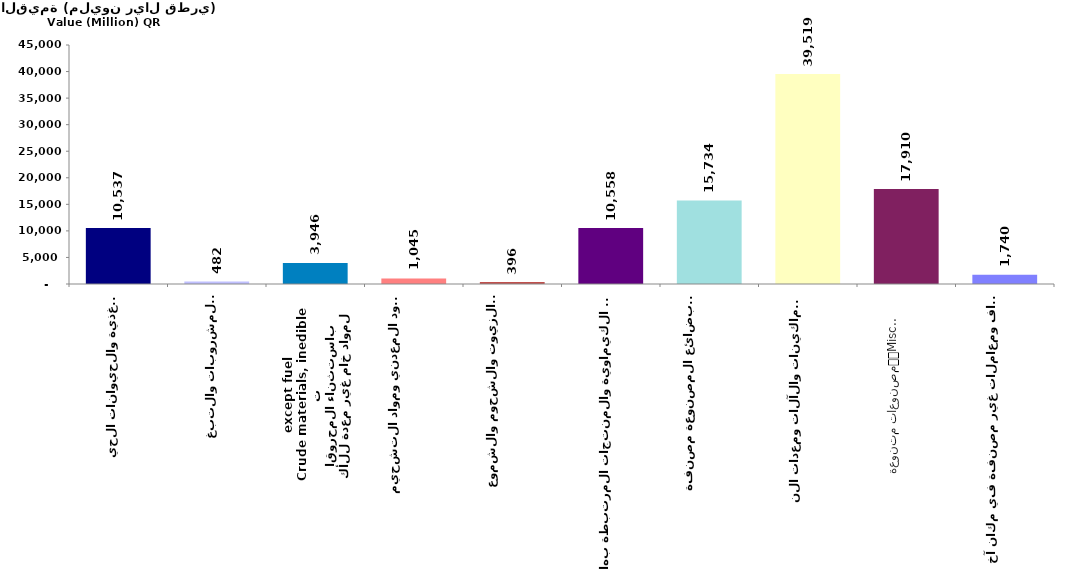
| Category | Series 0 |
|---|---|
| الأغذية والحيوانات الحية
Food and live animals | 10537.438 |
| المشروبات والتبغ
Beverages and tobacco | 481.766 |
| مواد خام غير معدة للأكل
باستثناء المحروقات
Crude materials, inedible
except fuels | 3946.01 |
| الوقود المعدني ومواد التشحيم
والمواد المشابهة
Mineral fuels, Lubricants
and related materials | 1044.801 |
| الزيوت والشحوم والشموع
الحيوانية والنباتية المنشأ
Animal and vegetable oils,
fats and waxes | 396.017 |
| المواد الكيماوية والمنتجات المرتبطة بها
Chemicals and related products | 10558.017 |
| البضائع المصنوعة مصنفة
في معظم الأحيان حسب المادة
Manufactured goods classified 
chiefly by materials | 15733.749 |
| الماكينات والآلات ومعدات النقل
Machinery and transport
equipment | 39519.079 |
| مصنوعات متنوعة
Miscellaneous manufactured
goods | 17909.6 |
| أصناف ومعاملات غير مصنفة في مكان آخر
Commodities and transactions
not classified in the SITC | 1740.392 |